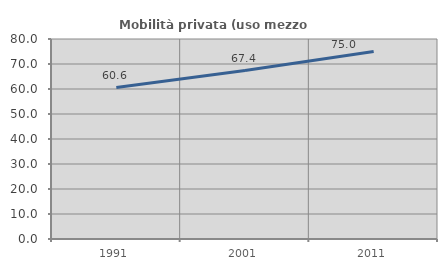
| Category | Mobilità privata (uso mezzo privato) |
|---|---|
| 1991.0 | 60.578 |
| 2001.0 | 67.373 |
| 2011.0 | 75 |